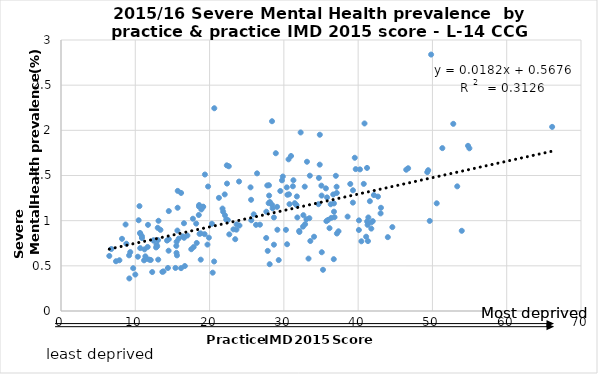
| Category | Mental health prev 1516 |
|---|---|
| 27.992 | 1.392 |
| 29.86 | 1.488 |
| 28.486 | 1.137 |
| 31.752 | 1.268 |
| 32.262 | 1.976 |
| 28.016 | 1.278 |
| 30.281 | 0.898 |
| 18.811 | 0.568 |
| 41.58 | 1.216 |
| 33.495 | 1.498 |
| 25.589 | 1.231 |
| 36.378 | 1.031 |
| 37.358 | 0.882 |
| 23.619 | 0.901 |
| 35.94 | 1.008 |
| 35.269 | 0.456 |
| 38.583 | 1.045 |
| 26.392 | 1.524 |
| 41.968 | 0.995 |
| 46.731 | 1.58 |
| 27.769 | 1.39 |
| 30.964 | 1.716 |
| 41.321 | 0.774 |
| 42.119 | 1.283 |
| 35.086 | 1.278 |
| 37.122 | 1.307 |
| 49.823 | 2.839 |
| 53.34 | 1.38 |
| 49.43 | 1.559 |
| 54.792 | 1.828 |
| 54.976 | 1.801 |
| 35.662 | 1.358 |
| 51.334 | 1.803 |
| 40.757 | 1.407 |
| 33.112 | 1.652 |
| 22.039 | 1.291 |
| 35.104 | 0.65 |
| 35.052 | 1.388 |
| 21.742 | 1.134 |
| 52.807 | 2.072 |
| 41.373 | 1.036 |
| 36.308 | 1.182 |
| 30.475 | 1.287 |
| 37.101 | 1.375 |
| 50.576 | 1.192 |
| 29.746 | 1.447 |
| 31.287 | 1.447 |
| 40.245 | 1.568 |
| 66.116 | 2.038 |
| 9.198 | 0.36 |
| 17.859 | 0.708 |
| 22.239 | 1.012 |
| 21.829 | 1.099 |
| 19.33 | 0.851 |
| 21.259 | 1.253 |
| 17.013 | 0.835 |
| 15.522 | 0.721 |
| 14.51 | 0.795 |
| 18.795 | 0.86 |
| 22.453 | 1.007 |
| 11.881 | 0.569 |
| 12.95 | 0.717 |
| 9.167 | 0.616 |
| 10.345 | 0.601 |
| 30.63 | 1.679 |
| 15.563 | 0.766 |
| 18.894 | 1.124 |
| 14.395 | 0.476 |
| 10.004 | 0.403 |
| 6.501 | 0.609 |
| 28.405 | 2.101 |
| 8.212 | 0.799 |
| 22.347 | 1.411 |
| 7.402 | 0.551 |
| 14.485 | 0.667 |
| 18.198 | 0.968 |
| 13.802 | 0.438 |
| 22.655 | 0.848 |
| 16.67 | 0.498 |
| 18.546 | 1.063 |
| 16.553 | 0.971 |
| 37.139 | 0.858 |
| 8.695 | 0.957 |
| 40.098 | 0.897 |
| 31.215 | 1.381 |
| 32.095 | 0.875 |
| 39.547 | 1.696 |
| 31.469 | 1.194 |
| 42.668 | 1.266 |
| 30.392 | 1.369 |
| 31.816 | 1.035 |
| 23.454 | 0.795 |
| 18.273 | 0.753 |
| 13.024 | 0.921 |
| 28.664 | 1.035 |
| 19.904 | 0.812 |
| 23.64 | 0.958 |
| 33.566 | 0.775 |
| 18.653 | 0.854 |
| 13.126 | 0.999 |
| 39.295 | 1.2 |
| 22.323 | 1.612 |
| 39.304 | 1.336 |
| 28.664 | 0.734 |
| 26.254 | 0.954 |
| 28.092 | 0.518 |
| 40.438 | 0.772 |
| 32.067 | 0.887 |
| 41.196 | 1.584 |
| 38.94 | 1.406 |
| 34.829 | 1.62 |
| 35.812 | 1.258 |
| 41.77 | 0.912 |
| 46.471 | 1.564 |
| 33.433 | 1.027 |
| 23.21 | 0.904 |
| 36.748 | 1.099 |
| 29.522 | 1.329 |
| 15.716 | 1.33 |
| 32.861 | 0.961 |
| 26.782 | 0.956 |
| 24.024 | 0.946 |
| 27.829 | 0.665 |
| 33.321 | 0.58 |
| 41.793 | 0.982 |
| 25.943 | 1.07 |
| 41.272 | 0.954 |
| 17.539 | 0.684 |
| 40.112 | 1.003 |
| 28.128 | 1.206 |
| 36.999 | 1.497 |
| 27.952 | 1.194 |
| 53.949 | 0.888 |
| 15.41 | 0.477 |
| 34.716 | 1.473 |
| 49.304 | 1.537 |
| 36.719 | 0.574 |
| 32.81 | 1.377 |
| 13.388 | 0.898 |
| 8.795 | 0.745 |
| 6.776 | 0.686 |
| 34.84 | 1.951 |
| 10.677 | 0.856 |
| 12.08 | 0.565 |
| 19.144 | 1.155 |
| 43.07 | 1.143 |
| 43.025 | 1.08 |
| 19.096 | 1.151 |
| 10.561 | 1.161 |
| 23.968 | 1.433 |
| 20.315 | 0.966 |
| 36.824 | 1.038 |
| 25.515 | 1.369 |
| 25.615 | 1.005 |
| 14.274 | 0.78 |
| 43.996 | 0.817 |
| 11.514 | 0.58 |
| 35.723 | 0.995 |
| 20.42 | 0.424 |
| 30.689 | 1.292 |
| 27.642 | 1.099 |
| 28.917 | 1.746 |
| 32.627 | 1.061 |
| 10.453 | 1.005 |
| 22.589 | 1.602 |
| 49.637 | 0.997 |
| 19.717 | 0.735 |
| 33.038 | 1.016 |
| 36.648 | 1.29 |
| 40.857 | 2.076 |
| 28.406 | 1.175 |
| 22.076 | 1.059 |
| 10.664 | 0.696 |
| 18.575 | 1.157 |
| 18.594 | 1.173 |
| 12.278 | 0.431 |
| 17.757 | 1.022 |
| 16.161 | 0.474 |
| 30.759 | 1.183 |
| 32.577 | 0.934 |
| 30.435 | 0.739 |
| 10.895 | 0.808 |
| 34.661 | 1.182 |
| 12.444 | 0.782 |
| 41.078 | 0.822 |
| 11.668 | 0.709 |
| 11.18 | 0.561 |
| 15.843 | 0.801 |
| 7.863 | 0.562 |
| 29.089 | 1.153 |
| 41.212 | 0.991 |
| 27.625 | 0.808 |
| 13.642 | 0.433 |
| 10.886 | 0.829 |
| 31.707 | 1.172 |
| 44.605 | 0.929 |
| 12.798 | 0.704 |
| 13.056 | 0.785 |
| 9.326 | 0.652 |
| 9.717 | 0.474 |
| 16.166 | 1.307 |
| 15.613 | 0.616 |
| 29.308 | 0.564 |
| 20.614 | 0.548 |
| 29.128 | 0.9 |
| 19.372 | 1.511 |
| 14.509 | 1.106 |
| 10.644 | 0.864 |
| 15.549 | 0.644 |
| 34.066 | 0.822 |
| 15.667 | 0.89 |
| 39.676 | 1.571 |
| 12.86 | 0.734 |
| 12.476 | 0.78 |
| 16.383 | 0.826 |
| 11.711 | 0.954 |
| 19.798 | 1.378 |
| 11.243 | 0.683 |
| 11.354 | 0.605 |
| 20.637 | 2.245 |
| 36.744 | 1.191 |
| 36.146 | 0.917 |
| 16.571 | 0.811 |
| 15.699 | 1.143 |
| 13.088 | 0.569 |